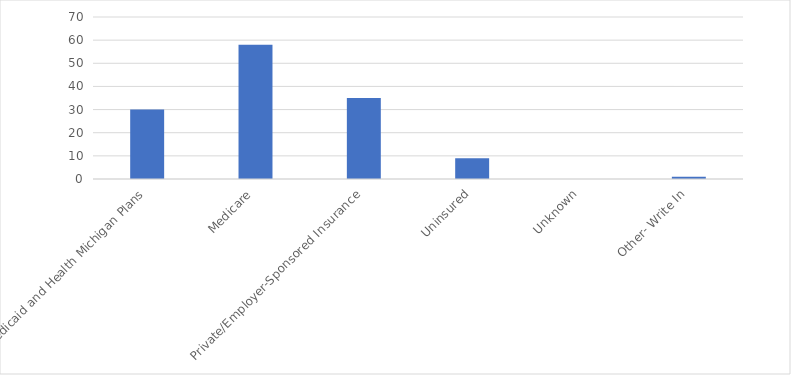
| Category | Number of Responses |
|---|---|
| Medicaid and Health Michigan Plans | 30 |
| Medicare | 58 |
| Private/Employer-Sponsored Insurance | 35 |
| Uninsured | 9 |
| Unknown | 0 |
| Other- Write In | 1 |